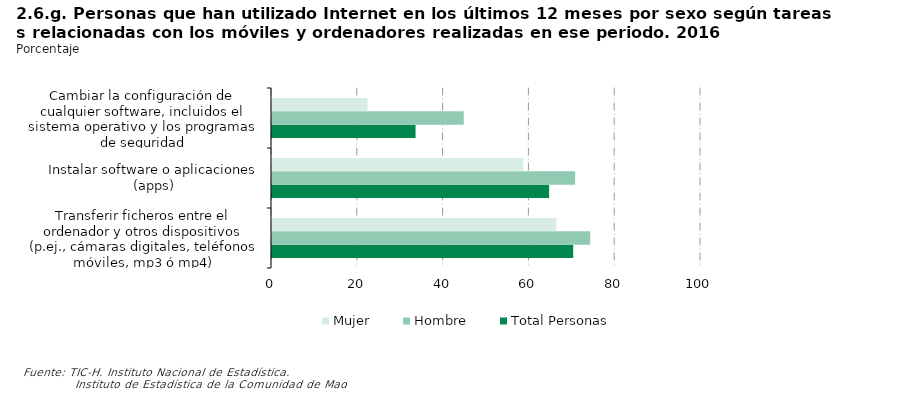
| Category | Total Personas | Hombre | Mujer |
|---|---|---|---|
| Transferir ficheros entre el ordenador y otros dispositivos (p.ej., cámaras digitales, teléfonos móviles, mp3 ó mp4) | 70.214 | 74.179 | 66.256 |
| Instalar software o aplicaciones (apps) | 64.602 | 70.662 | 58.552 |
| Cambiar la configuración de cualquier software, incluidos el sistema operativo y los programas de seguridad | 33.464 | 44.706 | 22.241 |